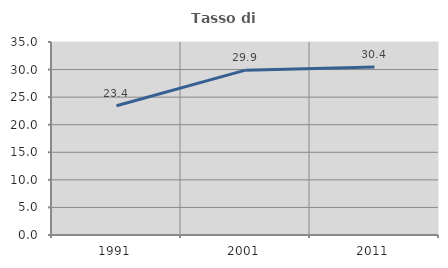
| Category | Tasso di occupazione   |
|---|---|
| 1991.0 | 23.45 |
| 2001.0 | 29.891 |
| 2011.0 | 30.447 |